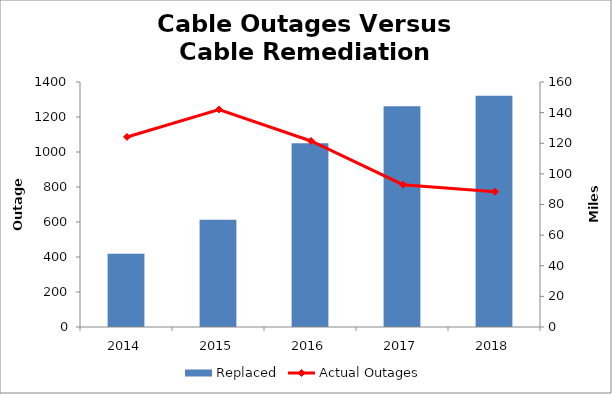
| Category | Replaced |
|---|---|
| 2014.0 | 47.9 |
| 2015.0 | 70 |
| 2016.0 | 120 |
| 2017.0 | 144.098 |
| 2018.0 | 151 |